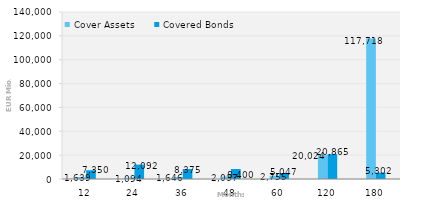
| Category | Cover Assets | Covered Bonds |
|---|---|---|
| 12.0 | 1639.306 | 7350 |
| 24.0 | 1094.093 | 12092.407 |
| 36.0 | 1646.453 | 8375 |
| 48.0 | 2037.194 | 8400 |
| 60.0 | 2755.005 | 5047.195 |
| 120.0 | 20024.124 | 20865 |
| 180.0 | 117718.286 | 5302.484 |